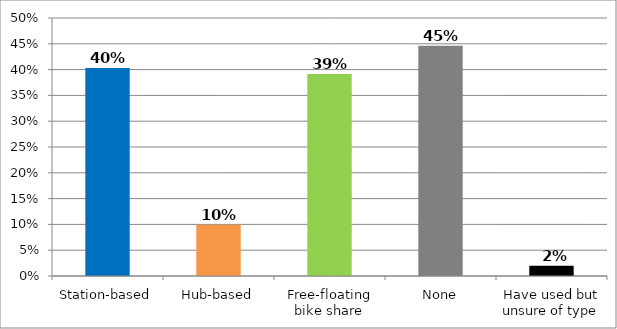
| Category | Responses |
|---|---|
| Station-based | 0.403 |
| Hub-based | 0.099 |
| Free-floating bike share | 0.391 |
| None | 0.446 |
| Have used but unsure of type | 0.02 |